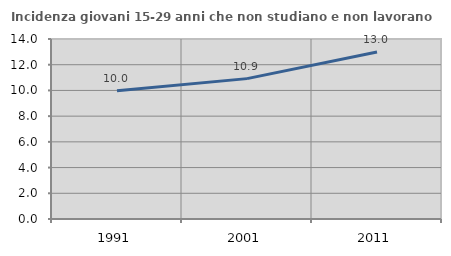
| Category | Incidenza giovani 15-29 anni che non studiano e non lavorano  |
|---|---|
| 1991.0 | 9.968 |
| 2001.0 | 10.918 |
| 2011.0 | 12.991 |